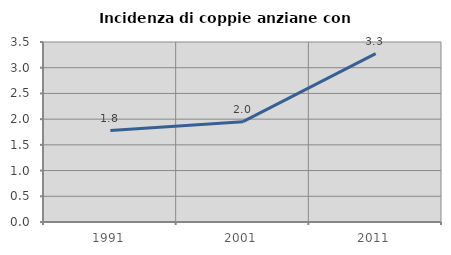
| Category | Incidenza di coppie anziane con figli |
|---|---|
| 1991.0 | 1.777 |
| 2001.0 | 1.951 |
| 2011.0 | 3.273 |